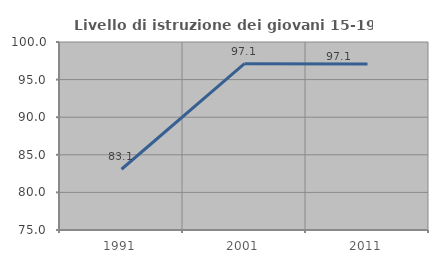
| Category | Livello di istruzione dei giovani 15-19 anni |
|---|---|
| 1991.0 | 83.077 |
| 2001.0 | 97.122 |
| 2011.0 | 97.083 |